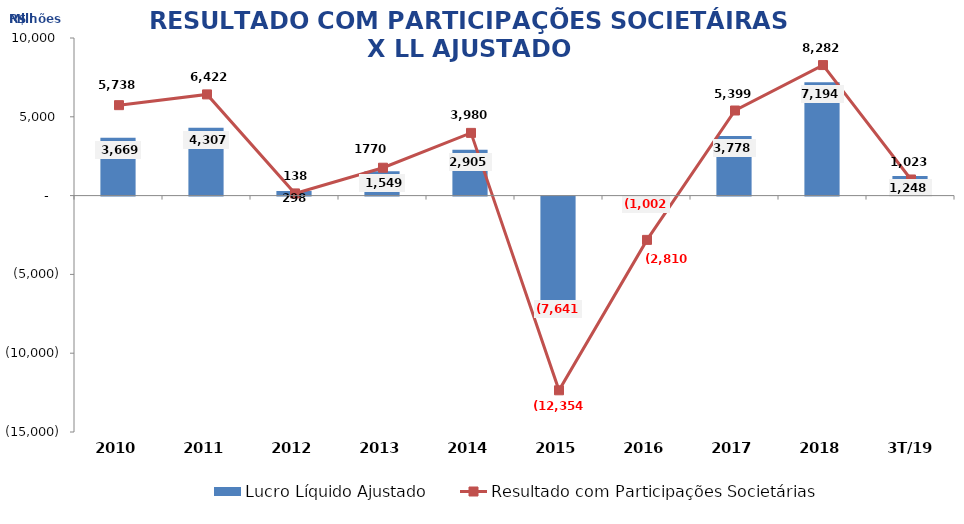
| Category | Lucro Líquido Ajustado |
|---|---|
| 2010 | 3669 |
| 2011 | 4306.5 |
| 2012 | 298 |
| 2013 | 1548.564 |
| 2014 | 2904.847 |
| 2015 | -7640.593 |
| 2016 | -1001.967 |
| 2017 | 3777.976 |
| 2018 | 7194 |
| 3T/19 | 1248.455 |